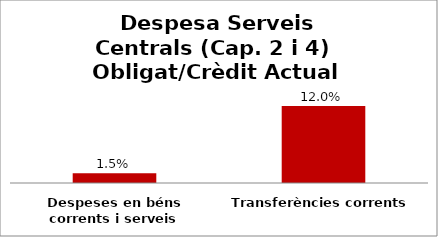
| Category | Series 0 |
|---|---|
| Despeses en béns corrents i serveis | 0.015 |
| Transferències corrents | 0.12 |